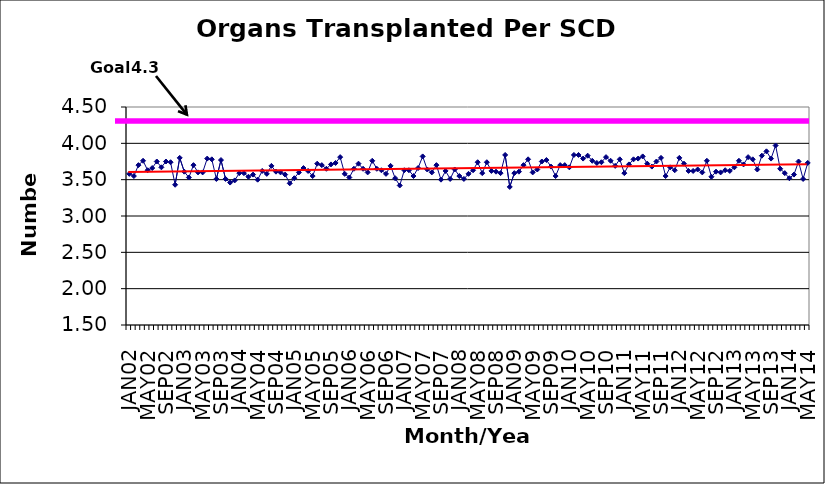
| Category | Series 0 |
|---|---|
| JAN02 | 3.58 |
| FEB02 | 3.55 |
| MAR02 | 3.7 |
| APR02 | 3.76 |
| MAY02 | 3.63 |
| JUN02 | 3.66 |
| JUL02 | 3.75 |
| AUG02 | 3.67 |
| SEP02 | 3.75 |
| OCT02 | 3.74 |
| NOV02 | 3.43 |
| DEC02 | 3.8 |
| JAN03 | 3.61 |
| FEB03 | 3.53 |
| MAR03 | 3.7 |
| APR03 | 3.6 |
| MAY03 | 3.6 |
| JUN03 | 3.79 |
| JUL03 | 3.78 |
| AUG03 | 3.51 |
| SEP03 | 3.77 |
| OCT03 | 3.51 |
| NOV03 | 3.46 |
| DEC03 | 3.49 |
| JAN04 | 3.59 |
| FEB04 | 3.59 |
| MAR04 | 3.54 |
| APR04 | 3.57 |
| MAY04 | 3.5 |
| JUN04 | 3.62 |
| JUL04 | 3.58 |
| AUG04 | 3.69 |
| SEP04 | 3.61 |
| OCT04 | 3.6 |
| NOV04 | 3.57 |
| DEC04 | 3.45 |
| JAN05 | 3.52 |
| FEB05 | 3.6 |
| MAR05 | 3.66 |
| APR05 | 3.62 |
| MAY05 | 3.55 |
| JUN05 | 3.72 |
| JUL05 | 3.7 |
| AUG05 | 3.65 |
| SEP05 | 3.71 |
| OCT05 | 3.73 |
| NOV05 | 3.81 |
| DEC05 | 3.58 |
| JAN06 | 3.53 |
| FEB06 | 3.65 |
| MAR06 | 3.72 |
| APR06 | 3.65 |
| MAY06 | 3.6 |
| JUN06 | 3.76 |
| JUL06 | 3.65 |
| AUG06 | 3.63 |
| SEP06 | 3.58 |
| OCT06 | 3.69 |
| NOV06 | 3.52 |
| DEC06 | 3.42 |
| JAN07 | 3.63 |
| FEB07 | 3.63 |
| MAR07 | 3.55 |
| APR07 | 3.66 |
| MAY07 | 3.82 |
| JUN07 | 3.64 |
| JUL07 | 3.6 |
| AUG07 | 3.7 |
| SEP07 | 3.5 |
| OCT07 | 3.62 |
| NOV07 | 3.51 |
| DEC07 | 3.64 |
| JAN08 | 3.55 |
| FEB08 | 3.51 |
| MAR08 | 3.58 |
| APR08 | 3.63 |
| MAY08 | 3.74 |
| JUN08 | 3.59 |
| JUL08 | 3.74 |
| AUG08 | 3.62 |
| SEP08 | 3.61 |
| OCT08 | 3.59 |
| NOV08 | 3.84 |
| DEC08 | 3.4 |
| JAN09 | 3.59 |
| FEB09 | 3.61 |
| MAR09 | 3.7 |
| APR09 | 3.78 |
| MAY09 | 3.6 |
| JUN09 | 3.64 |
| JUL09 | 3.75 |
| AUG09 | 3.77 |
| SEP09 | 3.68 |
| OCT09 | 3.55 |
| NOV09 | 3.7 |
| DEC09 | 3.7 |
| JAN10 | 3.67 |
| FEB10 | 3.84 |
| MAR10 | 3.84 |
| APR10 | 3.79 |
| MAY10 | 3.83 |
| JUN10 | 3.76 |
| JUL10 | 3.73 |
| AUG10 | 3.74 |
| SEP10 | 3.81 |
| OCT10 | 3.76 |
| NOV10 | 3.69 |
| DEC10 | 3.78 |
| JAN11 | 3.59 |
| FEB11 | 3.71 |
| MAR11 | 3.78 |
| APR11 | 3.79 |
| MAY11 | 3.82 |
| JUN11 | 3.72 |
| JUL11 | 3.68 |
| AUG11 | 3.75 |
| SEP11 | 3.8 |
| OCT11 | 3.55 |
| NOV11 | 3.67 |
| DEC11 | 3.63 |
| JAN12 | 3.8 |
| FEB12 | 3.72 |
| MAR12 | 3.62 |
| APR12 | 3.62 |
| MAY12 | 3.64 |
| JUN12 | 3.6 |
| JUL12 | 3.76 |
| AUG12 | 3.54 |
| SEP12 | 3.61 |
| OCT12 | 3.6 |
| NOV12 | 3.63 |
| DEC12 | 3.62 |
| JAN13 | 3.67 |
| FEB13 | 3.76 |
| MAR13 | 3.71 |
| APR13 | 3.81 |
| MAY13 | 3.78 |
| JUN13 | 3.64 |
| JUL13 | 3.83 |
| AUG13 | 3.89 |
| SEP13 | 3.79 |
| OCT13 | 3.97 |
| NOV13 | 3.65 |
| DEC13 | 3.59 |
| JAN14 | 3.52 |
| FEB14 | 3.57 |
| MAR14 | 3.75 |
| APR14 | 3.51 |
| MAY14 | 3.73 |